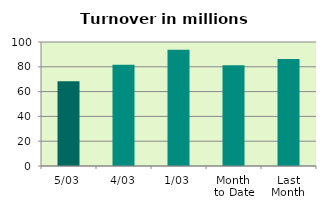
| Category | Series 0 |
|---|---|
| 5/03 | 68.376 |
| 4/03 | 81.665 |
| 1/03 | 93.764 |
| Month 
to Date | 81.268 |
| Last
Month | 86.247 |